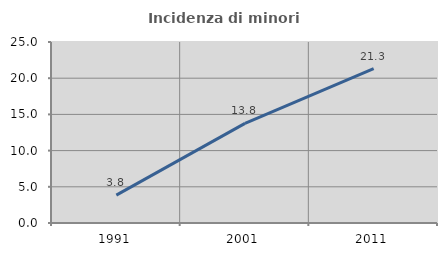
| Category | Incidenza di minori stranieri |
|---|---|
| 1991.0 | 3.846 |
| 2001.0 | 13.761 |
| 2011.0 | 21.314 |